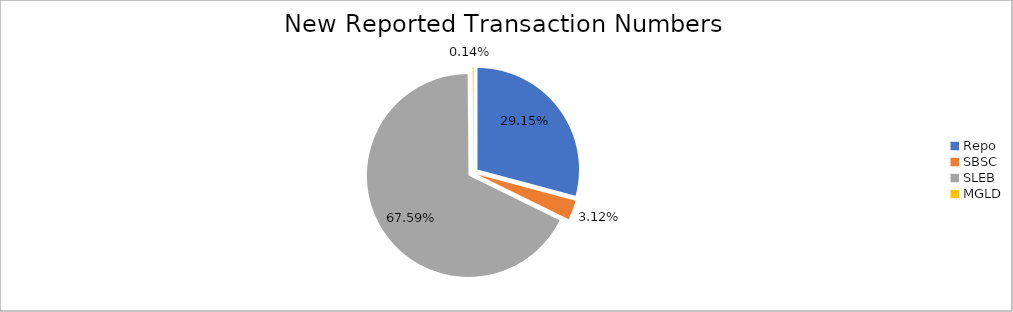
| Category | Series 0 |
|---|---|
| Repo | 389282 |
| SBSC | 41626 |
| SLEB | 902601 |
| MGLD | 1819 |